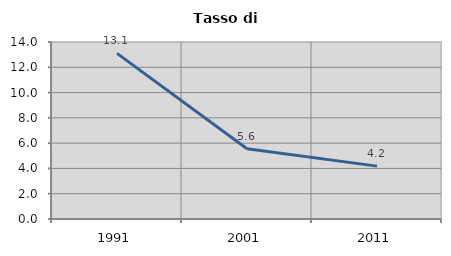
| Category | Tasso di disoccupazione   |
|---|---|
| 1991.0 | 13.099 |
| 2001.0 | 5.556 |
| 2011.0 | 4.181 |